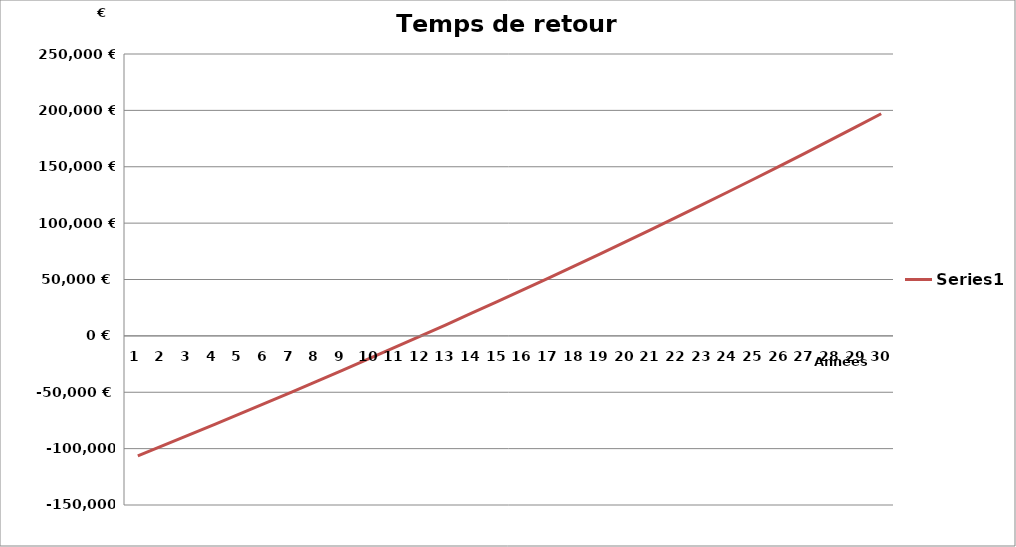
| Category | Series 0 |
|---|---|
| 0 | -106340 |
| 1 | -97107.615 |
| 2 | -87801.45 |
| 3 | -78420.092 |
| 4 | -68962.108 |
| 5 | -59426.044 |
| 6 | -49810.427 |
| 7 | -40113.765 |
| 8 | -30334.543 |
| 9 | -20471.227 |
| 10 | -10522.26 |
| 11 | -486.064 |
| 12 | 9638.959 |
| 13 | 19854.432 |
| 14 | 30161.999 |
| 15 | 40563.329 |
| 16 | 51060.111 |
| 17 | 61654.06 |
| 18 | 72346.914 |
| 19 | 83140.436 |
| 20 | 94036.414 |
| 21 | 105036.66 |
| 22 | 116143.012 |
| 23 | 127357.335 |
| 24 | 138681.518 |
| 25 | 150117.478 |
| 26 | 161667.159 |
| 27 | 173332.533 |
| 28 | 185115.599 |
| 29 | 197018.385 |